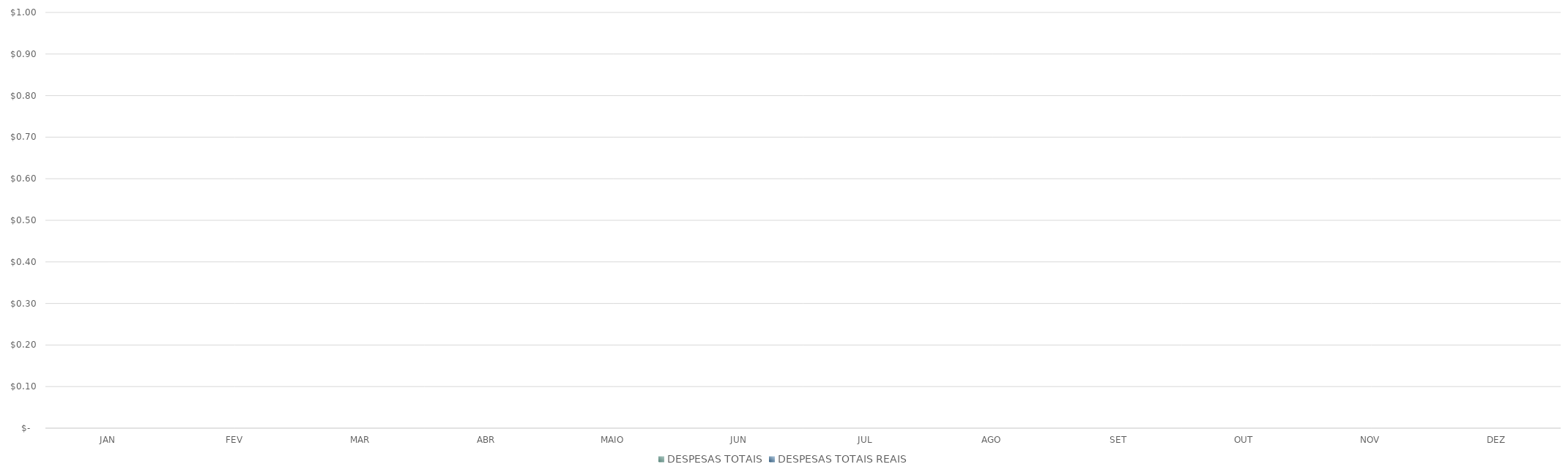
| Category | DESPESAS TOTAIS | DESPESAS TOTAIS REAIS |
|---|---|---|
| JAN | 0 | 0 |
| FEV | 0 | 0 |
| MAR | 0 | 0 |
| ABR | 0 | 0 |
| MAIO | 0 | 0 |
| JUN | 0 | 0 |
| JUL | 0 | 0 |
| AGO | 0 | 0 |
| SET | 0 | 0 |
| OUT | 0 | 0 |
| NOV | 0 | 0 |
| DEZ | 0 | 0 |